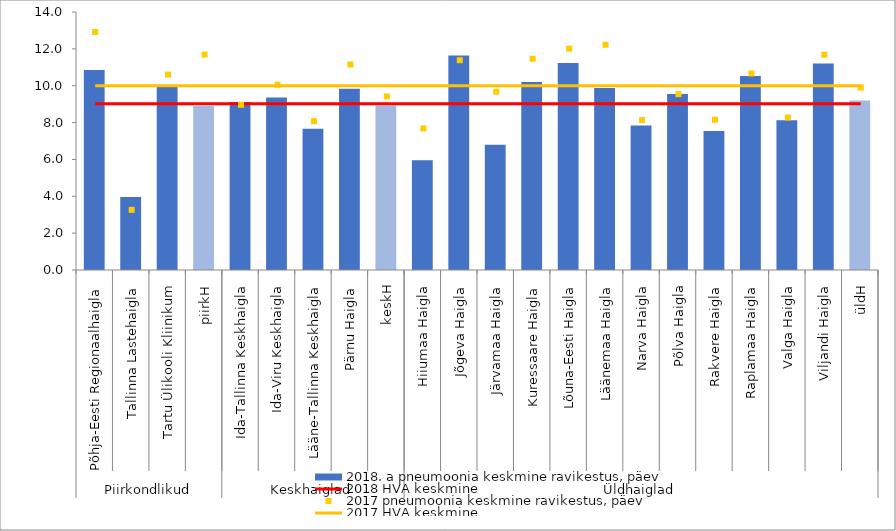
| Category | 2018. a pneumoonia keskmine ravikestus, päev |
|---|---|
| 0 | 10.858 |
| 1 | 3.955 |
| 2 | 9.949 |
| 3 | 8.905 |
| 4 | 9.11 |
| 5 | 9.358 |
| 6 | 7.665 |
| 7 | 9.841 |
| 8 | 8.942 |
| 9 | 5.95 |
| 10 | 11.638 |
| 11 | 6.797 |
| 12 | 10.2 |
| 13 | 11.237 |
| 14 | 9.87 |
| 15 | 7.84 |
| 16 | 9.55 |
| 17 | 7.537 |
| 18 | 10.532 |
| 19 | 8.129 |
| 20 | 11.204 |
| 21 | 9.198 |